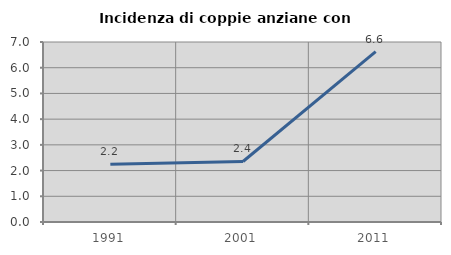
| Category | Incidenza di coppie anziane con figli |
|---|---|
| 1991.0 | 2.247 |
| 2001.0 | 2.353 |
| 2011.0 | 6.623 |